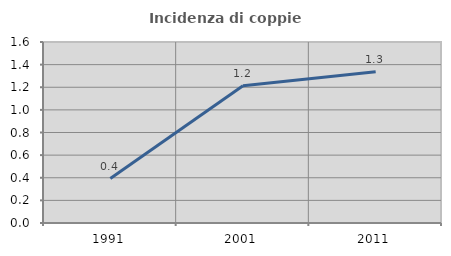
| Category | Incidenza di coppie miste |
|---|---|
| 1991.0 | 0.393 |
| 2001.0 | 1.214 |
| 2011.0 | 1.336 |